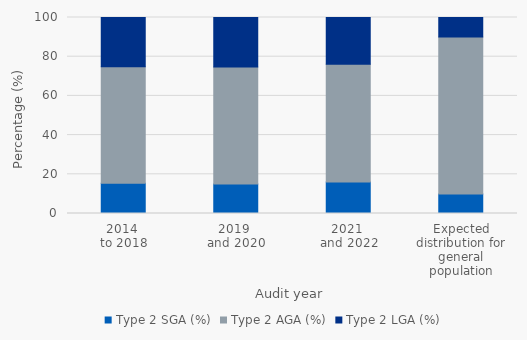
| Category | Type 2 |
|---|---|
| 2014 
to 2018 | 25.095 |
| 2019 
and 2020 | 25.305 |
| 2021 
and 2022 | 23.795 |
| Expected distribution for general population | 10 |